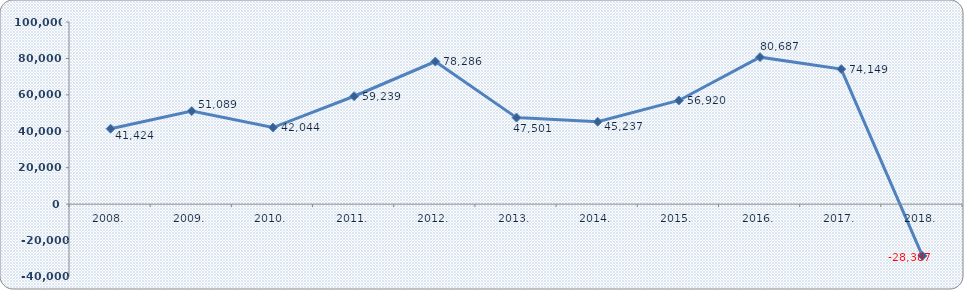
| Category | Dobit razdoblja (+) ili gubitak razdoblja (-)  |
|---|---|
| 2008. | 41424.228 |
| 2009. | 51088.856 |
| 2010. | 42043.525 |
| 2011. | 59238.783 |
| 2012. | 78285.762 |
| 2013. | 47501.12 |
| 2014. | 45237.495 |
| 2015. | 56920.488 |
| 2016. | 80686.791 |
| 2017. | 74148.637 |
| 2018. | -28386.614 |